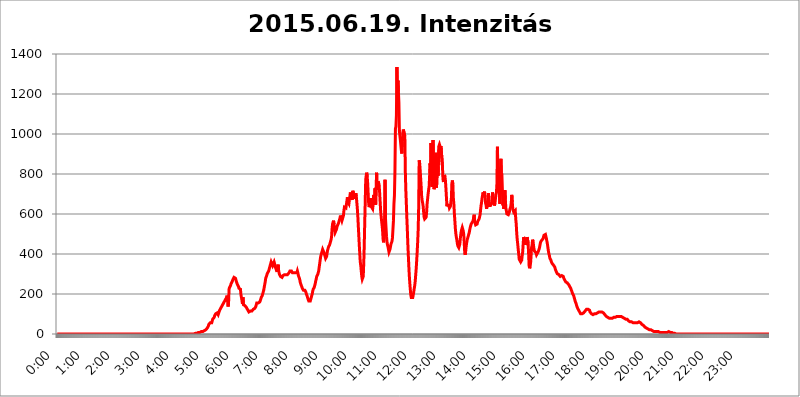
| Category | 2015.06.19. Intenzitás [W/m^2] |
|---|---|
| 0.0 | 0 |
| 0.0006944444444444445 | 0 |
| 0.001388888888888889 | 0 |
| 0.0020833333333333333 | 0 |
| 0.002777777777777778 | 0 |
| 0.003472222222222222 | 0 |
| 0.004166666666666667 | 0 |
| 0.004861111111111111 | 0 |
| 0.005555555555555556 | 0 |
| 0.0062499999999999995 | 0 |
| 0.006944444444444444 | 0 |
| 0.007638888888888889 | 0 |
| 0.008333333333333333 | 0 |
| 0.009027777777777779 | 0 |
| 0.009722222222222222 | 0 |
| 0.010416666666666666 | 0 |
| 0.011111111111111112 | 0 |
| 0.011805555555555555 | 0 |
| 0.012499999999999999 | 0 |
| 0.013194444444444444 | 0 |
| 0.013888888888888888 | 0 |
| 0.014583333333333332 | 0 |
| 0.015277777777777777 | 0 |
| 0.015972222222222224 | 0 |
| 0.016666666666666666 | 0 |
| 0.017361111111111112 | 0 |
| 0.018055555555555557 | 0 |
| 0.01875 | 0 |
| 0.019444444444444445 | 0 |
| 0.02013888888888889 | 0 |
| 0.020833333333333332 | 0 |
| 0.02152777777777778 | 0 |
| 0.022222222222222223 | 0 |
| 0.02291666666666667 | 0 |
| 0.02361111111111111 | 0 |
| 0.024305555555555556 | 0 |
| 0.024999999999999998 | 0 |
| 0.025694444444444447 | 0 |
| 0.02638888888888889 | 0 |
| 0.027083333333333334 | 0 |
| 0.027777777777777776 | 0 |
| 0.02847222222222222 | 0 |
| 0.029166666666666664 | 0 |
| 0.029861111111111113 | 0 |
| 0.030555555555555555 | 0 |
| 0.03125 | 0 |
| 0.03194444444444445 | 0 |
| 0.03263888888888889 | 0 |
| 0.03333333333333333 | 0 |
| 0.034027777777777775 | 0 |
| 0.034722222222222224 | 0 |
| 0.035416666666666666 | 0 |
| 0.036111111111111115 | 0 |
| 0.03680555555555556 | 0 |
| 0.0375 | 0 |
| 0.03819444444444444 | 0 |
| 0.03888888888888889 | 0 |
| 0.03958333333333333 | 0 |
| 0.04027777777777778 | 0 |
| 0.04097222222222222 | 0 |
| 0.041666666666666664 | 0 |
| 0.042361111111111106 | 0 |
| 0.04305555555555556 | 0 |
| 0.043750000000000004 | 0 |
| 0.044444444444444446 | 0 |
| 0.04513888888888889 | 0 |
| 0.04583333333333334 | 0 |
| 0.04652777777777778 | 0 |
| 0.04722222222222222 | 0 |
| 0.04791666666666666 | 0 |
| 0.04861111111111111 | 0 |
| 0.049305555555555554 | 0 |
| 0.049999999999999996 | 0 |
| 0.05069444444444445 | 0 |
| 0.051388888888888894 | 0 |
| 0.052083333333333336 | 0 |
| 0.05277777777777778 | 0 |
| 0.05347222222222222 | 0 |
| 0.05416666666666667 | 0 |
| 0.05486111111111111 | 0 |
| 0.05555555555555555 | 0 |
| 0.05625 | 0 |
| 0.05694444444444444 | 0 |
| 0.057638888888888885 | 0 |
| 0.05833333333333333 | 0 |
| 0.05902777777777778 | 0 |
| 0.059722222222222225 | 0 |
| 0.06041666666666667 | 0 |
| 0.061111111111111116 | 0 |
| 0.06180555555555556 | 0 |
| 0.0625 | 0 |
| 0.06319444444444444 | 0 |
| 0.06388888888888888 | 0 |
| 0.06458333333333334 | 0 |
| 0.06527777777777778 | 0 |
| 0.06597222222222222 | 0 |
| 0.06666666666666667 | 0 |
| 0.06736111111111111 | 0 |
| 0.06805555555555555 | 0 |
| 0.06874999999999999 | 0 |
| 0.06944444444444443 | 0 |
| 0.07013888888888889 | 0 |
| 0.07083333333333333 | 0 |
| 0.07152777777777779 | 0 |
| 0.07222222222222223 | 0 |
| 0.07291666666666667 | 0 |
| 0.07361111111111111 | 0 |
| 0.07430555555555556 | 0 |
| 0.075 | 0 |
| 0.07569444444444444 | 0 |
| 0.0763888888888889 | 0 |
| 0.07708333333333334 | 0 |
| 0.07777777777777778 | 0 |
| 0.07847222222222222 | 0 |
| 0.07916666666666666 | 0 |
| 0.0798611111111111 | 0 |
| 0.08055555555555556 | 0 |
| 0.08125 | 0 |
| 0.08194444444444444 | 0 |
| 0.08263888888888889 | 0 |
| 0.08333333333333333 | 0 |
| 0.08402777777777777 | 0 |
| 0.08472222222222221 | 0 |
| 0.08541666666666665 | 0 |
| 0.08611111111111112 | 0 |
| 0.08680555555555557 | 0 |
| 0.08750000000000001 | 0 |
| 0.08819444444444445 | 0 |
| 0.08888888888888889 | 0 |
| 0.08958333333333333 | 0 |
| 0.09027777777777778 | 0 |
| 0.09097222222222222 | 0 |
| 0.09166666666666667 | 0 |
| 0.09236111111111112 | 0 |
| 0.09305555555555556 | 0 |
| 0.09375 | 0 |
| 0.09444444444444444 | 0 |
| 0.09513888888888888 | 0 |
| 0.09583333333333333 | 0 |
| 0.09652777777777777 | 0 |
| 0.09722222222222222 | 0 |
| 0.09791666666666667 | 0 |
| 0.09861111111111111 | 0 |
| 0.09930555555555555 | 0 |
| 0.09999999999999999 | 0 |
| 0.10069444444444443 | 0 |
| 0.1013888888888889 | 0 |
| 0.10208333333333335 | 0 |
| 0.10277777777777779 | 0 |
| 0.10347222222222223 | 0 |
| 0.10416666666666667 | 0 |
| 0.10486111111111111 | 0 |
| 0.10555555555555556 | 0 |
| 0.10625 | 0 |
| 0.10694444444444444 | 0 |
| 0.1076388888888889 | 0 |
| 0.10833333333333334 | 0 |
| 0.10902777777777778 | 0 |
| 0.10972222222222222 | 0 |
| 0.1111111111111111 | 0 |
| 0.11180555555555556 | 0 |
| 0.11180555555555556 | 0 |
| 0.1125 | 0 |
| 0.11319444444444444 | 0 |
| 0.11388888888888889 | 0 |
| 0.11458333333333333 | 0 |
| 0.11527777777777777 | 0 |
| 0.11597222222222221 | 0 |
| 0.11666666666666665 | 0 |
| 0.1173611111111111 | 0 |
| 0.11805555555555557 | 0 |
| 0.11944444444444445 | 0 |
| 0.12013888888888889 | 0 |
| 0.12083333333333333 | 0 |
| 0.12152777777777778 | 0 |
| 0.12222222222222223 | 0 |
| 0.12291666666666667 | 0 |
| 0.12291666666666667 | 0 |
| 0.12361111111111112 | 0 |
| 0.12430555555555556 | 0 |
| 0.125 | 0 |
| 0.12569444444444444 | 0 |
| 0.12638888888888888 | 0 |
| 0.12708333333333333 | 0 |
| 0.16875 | 0 |
| 0.12847222222222224 | 0 |
| 0.12916666666666668 | 0 |
| 0.12986111111111112 | 0 |
| 0.13055555555555556 | 0 |
| 0.13125 | 0 |
| 0.13194444444444445 | 0 |
| 0.1326388888888889 | 0 |
| 0.13333333333333333 | 0 |
| 0.13402777777777777 | 0 |
| 0.13402777777777777 | 0 |
| 0.13472222222222222 | 0 |
| 0.13541666666666666 | 0 |
| 0.1361111111111111 | 0 |
| 0.13749999999999998 | 0 |
| 0.13819444444444443 | 0 |
| 0.1388888888888889 | 0 |
| 0.13958333333333334 | 0 |
| 0.14027777777777778 | 0 |
| 0.14097222222222222 | 0 |
| 0.14166666666666666 | 0 |
| 0.1423611111111111 | 0 |
| 0.14305555555555557 | 0 |
| 0.14375000000000002 | 0 |
| 0.14444444444444446 | 0 |
| 0.1451388888888889 | 0 |
| 0.1451388888888889 | 0 |
| 0.14652777777777778 | 0 |
| 0.14722222222222223 | 0 |
| 0.14791666666666667 | 0 |
| 0.1486111111111111 | 0 |
| 0.14930555555555555 | 0 |
| 0.15 | 0 |
| 0.15069444444444444 | 0 |
| 0.15138888888888888 | 0 |
| 0.15208333333333332 | 0 |
| 0.15277777777777776 | 0 |
| 0.15347222222222223 | 0 |
| 0.15416666666666667 | 0 |
| 0.15486111111111112 | 0 |
| 0.15555555555555556 | 0 |
| 0.15625 | 0 |
| 0.15694444444444444 | 0 |
| 0.15763888888888888 | 0 |
| 0.15833333333333333 | 0 |
| 0.15902777777777777 | 0 |
| 0.15972222222222224 | 0 |
| 0.16041666666666668 | 0 |
| 0.16111111111111112 | 0 |
| 0.16180555555555556 | 0 |
| 0.1625 | 0 |
| 0.16319444444444445 | 0 |
| 0.1638888888888889 | 0 |
| 0.16458333333333333 | 0 |
| 0.16527777777777777 | 0 |
| 0.16597222222222222 | 0 |
| 0.16666666666666666 | 0 |
| 0.1673611111111111 | 0 |
| 0.16805555555555554 | 0 |
| 0.16874999999999998 | 0 |
| 0.16944444444444443 | 0 |
| 0.17013888888888887 | 0 |
| 0.1708333333333333 | 0 |
| 0.17152777777777775 | 0 |
| 0.17222222222222225 | 0 |
| 0.1729166666666667 | 0 |
| 0.17361111111111113 | 0 |
| 0.17430555555555557 | 0 |
| 0.17500000000000002 | 0 |
| 0.17569444444444446 | 0 |
| 0.1763888888888889 | 0 |
| 0.17708333333333334 | 0 |
| 0.17777777777777778 | 0 |
| 0.17847222222222223 | 0 |
| 0.17916666666666667 | 0 |
| 0.1798611111111111 | 0 |
| 0.18055555555555555 | 0 |
| 0.18125 | 0 |
| 0.18194444444444444 | 0 |
| 0.1826388888888889 | 0 |
| 0.18333333333333335 | 0 |
| 0.1840277777777778 | 0 |
| 0.18472222222222223 | 0 |
| 0.18541666666666667 | 0 |
| 0.18611111111111112 | 0 |
| 0.18680555555555556 | 0 |
| 0.1875 | 0 |
| 0.18819444444444444 | 0 |
| 0.18888888888888888 | 0 |
| 0.18958333333333333 | 0 |
| 0.19027777777777777 | 0 |
| 0.1909722222222222 | 0 |
| 0.19166666666666665 | 0 |
| 0.19236111111111112 | 3.525 |
| 0.19305555555555554 | 3.525 |
| 0.19375 | 3.525 |
| 0.19444444444444445 | 3.525 |
| 0.1951388888888889 | 3.525 |
| 0.19583333333333333 | 3.525 |
| 0.19652777777777777 | 3.525 |
| 0.19722222222222222 | 3.525 |
| 0.19791666666666666 | 7.887 |
| 0.1986111111111111 | 7.887 |
| 0.19930555555555554 | 7.887 |
| 0.19999999999999998 | 7.887 |
| 0.20069444444444443 | 7.887 |
| 0.20138888888888887 | 12.257 |
| 0.2020833333333333 | 12.257 |
| 0.2027777777777778 | 12.257 |
| 0.2034722222222222 | 12.257 |
| 0.2041666666666667 | 12.257 |
| 0.20486111111111113 | 16.636 |
| 0.20555555555555557 | 16.636 |
| 0.20625000000000002 | 16.636 |
| 0.20694444444444446 | 21.024 |
| 0.2076388888888889 | 21.024 |
| 0.20833333333333334 | 21.024 |
| 0.20902777777777778 | 25.419 |
| 0.20972222222222223 | 25.419 |
| 0.21041666666666667 | 29.823 |
| 0.2111111111111111 | 34.234 |
| 0.21180555555555555 | 38.653 |
| 0.2125 | 47.511 |
| 0.21319444444444444 | 51.951 |
| 0.2138888888888889 | 51.951 |
| 0.21458333333333335 | 56.398 |
| 0.2152777777777778 | 56.398 |
| 0.21597222222222223 | 56.398 |
| 0.21666666666666667 | 56.398 |
| 0.21736111111111112 | 60.85 |
| 0.21805555555555556 | 74.246 |
| 0.21875 | 78.722 |
| 0.21944444444444444 | 78.722 |
| 0.22013888888888888 | 83.205 |
| 0.22083333333333333 | 92.184 |
| 0.22152777777777777 | 96.682 |
| 0.2222222222222222 | 101.184 |
| 0.22291666666666665 | 101.184 |
| 0.2236111111111111 | 101.184 |
| 0.22430555555555556 | 105.69 |
| 0.225 | 110.201 |
| 0.22569444444444445 | 96.682 |
| 0.2263888888888889 | 92.184 |
| 0.22708333333333333 | 101.184 |
| 0.22777777777777777 | 119.235 |
| 0.22847222222222222 | 123.758 |
| 0.22916666666666666 | 128.284 |
| 0.2298611111111111 | 132.814 |
| 0.23055555555555554 | 137.347 |
| 0.23124999999999998 | 141.884 |
| 0.23194444444444443 | 146.423 |
| 0.23263888888888887 | 146.423 |
| 0.2333333333333333 | 155.509 |
| 0.2340277777777778 | 160.056 |
| 0.2347222222222222 | 164.605 |
| 0.2354166666666667 | 169.156 |
| 0.23611111111111113 | 173.709 |
| 0.23680555555555557 | 178.264 |
| 0.23750000000000002 | 182.82 |
| 0.23819444444444446 | 191.937 |
| 0.2388888888888889 | 164.605 |
| 0.23958333333333334 | 137.347 |
| 0.24027777777777778 | 155.509 |
| 0.24097222222222223 | 223.873 |
| 0.24166666666666667 | 233 |
| 0.2423611111111111 | 237.564 |
| 0.24305555555555555 | 242.127 |
| 0.24375 | 251.251 |
| 0.24444444444444446 | 251.251 |
| 0.24513888888888888 | 260.373 |
| 0.24583333333333335 | 264.932 |
| 0.2465277777777778 | 274.047 |
| 0.24722222222222223 | 278.603 |
| 0.24791666666666667 | 283.156 |
| 0.24861111111111112 | 283.156 |
| 0.24930555555555556 | 283.156 |
| 0.25 | 278.603 |
| 0.25069444444444444 | 269.49 |
| 0.2513888888888889 | 260.373 |
| 0.2520833333333333 | 255.813 |
| 0.25277777777777777 | 246.689 |
| 0.2534722222222222 | 242.127 |
| 0.25416666666666665 | 237.564 |
| 0.2548611111111111 | 228.436 |
| 0.2555555555555556 | 228.436 |
| 0.25625000000000003 | 223.873 |
| 0.2569444444444445 | 223.873 |
| 0.2576388888888889 | 196.497 |
| 0.25833333333333336 | 196.497 |
| 0.2590277777777778 | 169.156 |
| 0.25972222222222224 | 150.964 |
| 0.2604166666666667 | 182.82 |
| 0.2611111111111111 | 146.423 |
| 0.26180555555555557 | 146.423 |
| 0.2625 | 141.884 |
| 0.26319444444444445 | 141.884 |
| 0.2638888888888889 | 137.347 |
| 0.26458333333333334 | 137.347 |
| 0.2652777777777778 | 132.814 |
| 0.2659722222222222 | 128.284 |
| 0.26666666666666666 | 128.284 |
| 0.2673611111111111 | 119.235 |
| 0.26805555555555555 | 114.716 |
| 0.26875 | 110.201 |
| 0.26944444444444443 | 110.201 |
| 0.2701388888888889 | 110.201 |
| 0.2708333333333333 | 114.716 |
| 0.27152777777777776 | 114.716 |
| 0.2722222222222222 | 114.716 |
| 0.27291666666666664 | 114.716 |
| 0.2736111111111111 | 119.235 |
| 0.2743055555555555 | 119.235 |
| 0.27499999999999997 | 123.758 |
| 0.27569444444444446 | 123.758 |
| 0.27638888888888885 | 128.284 |
| 0.27708333333333335 | 128.284 |
| 0.2777777777777778 | 132.814 |
| 0.27847222222222223 | 137.347 |
| 0.2791666666666667 | 146.423 |
| 0.2798611111111111 | 155.509 |
| 0.28055555555555556 | 160.056 |
| 0.28125 | 160.056 |
| 0.28194444444444444 | 155.509 |
| 0.2826388888888889 | 155.509 |
| 0.2833333333333333 | 155.509 |
| 0.28402777777777777 | 160.056 |
| 0.2847222222222222 | 164.605 |
| 0.28541666666666665 | 173.709 |
| 0.28611111111111115 | 182.82 |
| 0.28680555555555554 | 187.378 |
| 0.28750000000000003 | 191.937 |
| 0.2881944444444445 | 201.058 |
| 0.2888888888888889 | 210.182 |
| 0.28958333333333336 | 219.309 |
| 0.2902777777777778 | 233 |
| 0.29097222222222224 | 246.689 |
| 0.2916666666666667 | 260.373 |
| 0.2923611111111111 | 278.603 |
| 0.29305555555555557 | 283.156 |
| 0.29375 | 292.259 |
| 0.29444444444444445 | 301.354 |
| 0.2951388888888889 | 301.354 |
| 0.29583333333333334 | 305.898 |
| 0.2965277777777778 | 314.98 |
| 0.2972222222222222 | 324.052 |
| 0.29791666666666666 | 328.584 |
| 0.2986111111111111 | 342.162 |
| 0.29930555555555555 | 351.198 |
| 0.3 | 360.221 |
| 0.30069444444444443 | 364.728 |
| 0.3013888888888889 | 360.221 |
| 0.3020833333333333 | 342.162 |
| 0.30277777777777776 | 342.162 |
| 0.3034722222222222 | 342.162 |
| 0.30416666666666664 | 360.221 |
| 0.3048611111111111 | 351.198 |
| 0.3055555555555555 | 337.639 |
| 0.30624999999999997 | 333.113 |
| 0.3069444444444444 | 324.052 |
| 0.3076388888888889 | 319.517 |
| 0.30833333333333335 | 310.44 |
| 0.3090277777777778 | 314.98 |
| 0.30972222222222223 | 346.682 |
| 0.3104166666666667 | 319.517 |
| 0.3111111111111111 | 305.898 |
| 0.31180555555555556 | 296.808 |
| 0.3125 | 296.808 |
| 0.31319444444444444 | 287.709 |
| 0.3138888888888889 | 283.156 |
| 0.3145833333333333 | 283.156 |
| 0.31527777777777777 | 283.156 |
| 0.3159722222222222 | 287.709 |
| 0.31666666666666665 | 292.259 |
| 0.31736111111111115 | 296.808 |
| 0.31805555555555554 | 296.808 |
| 0.31875000000000003 | 296.808 |
| 0.3194444444444445 | 296.808 |
| 0.3201388888888889 | 296.808 |
| 0.32083333333333336 | 296.808 |
| 0.3215277777777778 | 296.808 |
| 0.32222222222222224 | 296.808 |
| 0.3229166666666667 | 296.808 |
| 0.3236111111111111 | 301.354 |
| 0.32430555555555557 | 301.354 |
| 0.325 | 305.898 |
| 0.32569444444444445 | 310.44 |
| 0.3263888888888889 | 314.98 |
| 0.32708333333333334 | 319.517 |
| 0.3277777777777778 | 319.517 |
| 0.3284722222222222 | 314.98 |
| 0.32916666666666666 | 310.44 |
| 0.3298611111111111 | 305.898 |
| 0.33055555555555555 | 305.898 |
| 0.33125 | 305.898 |
| 0.33194444444444443 | 305.898 |
| 0.3326388888888889 | 305.898 |
| 0.3333333333333333 | 310.44 |
| 0.3340277777777778 | 305.898 |
| 0.3347222222222222 | 305.898 |
| 0.3354166666666667 | 305.898 |
| 0.3361111111111111 | 305.898 |
| 0.3368055555555556 | 314.98 |
| 0.33749999999999997 | 305.898 |
| 0.33819444444444446 | 292.259 |
| 0.33888888888888885 | 287.709 |
| 0.33958333333333335 | 278.603 |
| 0.34027777777777773 | 269.49 |
| 0.34097222222222223 | 255.813 |
| 0.3416666666666666 | 251.251 |
| 0.3423611111111111 | 242.127 |
| 0.3430555555555555 | 237.564 |
| 0.34375 | 228.436 |
| 0.3444444444444445 | 228.436 |
| 0.3451388888888889 | 219.309 |
| 0.3458333333333334 | 219.309 |
| 0.34652777777777777 | 219.309 |
| 0.34722222222222227 | 219.309 |
| 0.34791666666666665 | 214.746 |
| 0.34861111111111115 | 210.182 |
| 0.34930555555555554 | 201.058 |
| 0.35000000000000003 | 196.497 |
| 0.3506944444444444 | 187.378 |
| 0.3513888888888889 | 178.264 |
| 0.3520833333333333 | 173.709 |
| 0.3527777777777778 | 164.605 |
| 0.3534722222222222 | 160.056 |
| 0.3541666666666667 | 160.056 |
| 0.3548611111111111 | 164.605 |
| 0.35555555555555557 | 173.709 |
| 0.35625 | 182.82 |
| 0.35694444444444445 | 191.937 |
| 0.3576388888888889 | 201.058 |
| 0.35833333333333334 | 214.746 |
| 0.3590277777777778 | 223.873 |
| 0.3597222222222222 | 228.436 |
| 0.36041666666666666 | 233 |
| 0.3611111111111111 | 242.127 |
| 0.36180555555555555 | 251.251 |
| 0.3625 | 264.932 |
| 0.36319444444444443 | 274.047 |
| 0.3638888888888889 | 287.709 |
| 0.3645833333333333 | 292.259 |
| 0.3652777777777778 | 296.808 |
| 0.3659722222222222 | 305.898 |
| 0.3666666666666667 | 314.98 |
| 0.3673611111111111 | 333.113 |
| 0.3680555555555556 | 351.198 |
| 0.36874999999999997 | 369.23 |
| 0.36944444444444446 | 387.202 |
| 0.37013888888888885 | 396.164 |
| 0.37083333333333335 | 405.108 |
| 0.37152777777777773 | 414.035 |
| 0.37222222222222223 | 422.943 |
| 0.3729166666666666 | 418.492 |
| 0.3736111111111111 | 418.492 |
| 0.3743055555555555 | 405.108 |
| 0.375 | 396.164 |
| 0.3756944444444445 | 387.202 |
| 0.3763888888888889 | 378.224 |
| 0.3770833333333334 | 373.729 |
| 0.37777777777777777 | 387.202 |
| 0.37847222222222227 | 405.108 |
| 0.37916666666666665 | 418.492 |
| 0.37986111111111115 | 427.39 |
| 0.38055555555555554 | 436.27 |
| 0.38125000000000003 | 440.702 |
| 0.3819444444444444 | 445.129 |
| 0.3826388888888889 | 453.968 |
| 0.3833333333333333 | 458.38 |
| 0.3840277777777778 | 471.582 |
| 0.3847222222222222 | 484.735 |
| 0.3854166666666667 | 523.88 |
| 0.3861111111111111 | 549.704 |
| 0.38680555555555557 | 558.261 |
| 0.3875 | 566.793 |
| 0.38819444444444445 | 549.704 |
| 0.3888888888888889 | 519.555 |
| 0.38958333333333334 | 506.542 |
| 0.3902777777777778 | 502.192 |
| 0.3909722222222222 | 506.542 |
| 0.39166666666666666 | 523.88 |
| 0.3923611111111111 | 536.82 |
| 0.39305555555555555 | 541.121 |
| 0.39375 | 541.121 |
| 0.39444444444444443 | 553.986 |
| 0.3951388888888889 | 562.53 |
| 0.3958333333333333 | 571.049 |
| 0.3965277777777778 | 579.542 |
| 0.3972222222222222 | 592.233 |
| 0.3979166666666667 | 588.009 |
| 0.3986111111111111 | 575.299 |
| 0.3993055555555556 | 566.793 |
| 0.39999999999999997 | 562.53 |
| 0.40069444444444446 | 571.049 |
| 0.40138888888888885 | 592.233 |
| 0.40208333333333335 | 617.436 |
| 0.40277777777777773 | 634.105 |
| 0.40347222222222223 | 634.105 |
| 0.4041666666666666 | 638.256 |
| 0.4048611111111111 | 629.948 |
| 0.4055555555555555 | 625.784 |
| 0.40625 | 634.105 |
| 0.4069444444444445 | 683.473 |
| 0.4076388888888889 | 658.909 |
| 0.4083333333333334 | 663.019 |
| 0.40902777777777777 | 650.667 |
| 0.40972222222222227 | 671.22 |
| 0.41041666666666665 | 687.544 |
| 0.41111111111111115 | 707.8 |
| 0.41180555555555554 | 691.608 |
| 0.41250000000000003 | 683.473 |
| 0.4131944444444444 | 687.544 |
| 0.4138888888888889 | 671.22 |
| 0.4145833333333333 | 715.858 |
| 0.4152777777777778 | 703.762 |
| 0.4159722222222222 | 691.608 |
| 0.4166666666666667 | 675.311 |
| 0.4173611111111111 | 687.544 |
| 0.41805555555555557 | 695.666 |
| 0.41875 | 703.762 |
| 0.41944444444444445 | 687.544 |
| 0.4201388888888889 | 658.909 |
| 0.42083333333333334 | 629.948 |
| 0.4215277777777778 | 592.233 |
| 0.4222222222222222 | 541.121 |
| 0.42291666666666666 | 493.475 |
| 0.4236111111111111 | 445.129 |
| 0.42430555555555555 | 400.638 |
| 0.425 | 360.221 |
| 0.42569444444444443 | 342.162 |
| 0.4263888888888889 | 314.98 |
| 0.4270833333333333 | 287.709 |
| 0.4277777777777778 | 274.047 |
| 0.4284722222222222 | 274.047 |
| 0.4291666666666667 | 287.709 |
| 0.4298611111111111 | 351.198 |
| 0.4305555555555556 | 440.702 |
| 0.43124999999999997 | 553.986 |
| 0.43194444444444446 | 658.909 |
| 0.43263888888888885 | 771.559 |
| 0.43333333333333335 | 791.169 |
| 0.43402777777777773 | 806.757 |
| 0.43472222222222223 | 787.258 |
| 0.4354166666666666 | 751.803 |
| 0.4361111111111111 | 699.717 |
| 0.4368055555555555 | 650.667 |
| 0.4375 | 634.105 |
| 0.4381944444444445 | 642.4 |
| 0.4388888888888889 | 663.019 |
| 0.4395833333333334 | 679.395 |
| 0.44027777777777777 | 638.256 |
| 0.44097222222222227 | 634.105 |
| 0.44166666666666665 | 642.4 |
| 0.44236111111111115 | 625.784 |
| 0.44305555555555554 | 646.537 |
| 0.44375000000000003 | 695.666 |
| 0.4444444444444444 | 691.608 |
| 0.4451388888888889 | 658.909 |
| 0.4458333333333333 | 727.896 |
| 0.4465277777777778 | 646.537 |
| 0.4472222222222222 | 731.896 |
| 0.4479166666666667 | 806.757 |
| 0.4486111111111111 | 719.877 |
| 0.44930555555555557 | 751.803 |
| 0.45 | 763.674 |
| 0.45069444444444445 | 755.766 |
| 0.4513888888888889 | 747.834 |
| 0.45208333333333334 | 711.832 |
| 0.4527777777777778 | 667.123 |
| 0.4534722222222222 | 621.613 |
| 0.45416666666666666 | 592.233 |
| 0.4548611111111111 | 566.793 |
| 0.45555555555555555 | 545.416 |
| 0.45625 | 519.555 |
| 0.45694444444444443 | 475.972 |
| 0.4576388888888889 | 458.38 |
| 0.4583333333333333 | 484.735 |
| 0.4590277777777778 | 566.793 |
| 0.4597222222222222 | 771.559 |
| 0.4604166666666667 | 575.299 |
| 0.4611111111111111 | 532.513 |
| 0.4618055555555556 | 489.108 |
| 0.46249999999999997 | 458.38 |
| 0.46319444444444446 | 445.129 |
| 0.46388888888888885 | 436.27 |
| 0.46458333333333335 | 422.943 |
| 0.46527777777777773 | 409.574 |
| 0.46597222222222223 | 405.108 |
| 0.4666666666666666 | 422.943 |
| 0.4673611111111111 | 436.27 |
| 0.4680555555555555 | 449.551 |
| 0.46875 | 449.551 |
| 0.4694444444444445 | 462.786 |
| 0.4701388888888889 | 480.356 |
| 0.4708333333333334 | 523.88 |
| 0.47152777777777777 | 566.793 |
| 0.47222222222222227 | 650.667 |
| 0.47291666666666665 | 691.608 |
| 0.47361111111111115 | 810.641 |
| 0.47430555555555554 | 1026.06 |
| 0.47500000000000003 | 1037.277 |
| 0.4756944444444444 | 1093.653 |
| 0.4763888888888889 | 1335.223 |
| 0.4770833333333333 | 1162.571 |
| 0.4777777777777778 | 1266.8 |
| 0.4784722222222222 | 1213.804 |
| 0.4791666666666667 | 1158.689 |
| 0.4798611111111111 | 1014.852 |
| 0.48055555555555557 | 1011.118 |
| 0.48125 | 970.034 |
| 0.48194444444444445 | 970.034 |
| 0.4826388888888889 | 917.534 |
| 0.48333333333333334 | 902.447 |
| 0.4840277777777778 | 962.555 |
| 0.4847222222222222 | 1007.383 |
| 0.48541666666666666 | 1022.323 |
| 0.4861111111111111 | 1018.587 |
| 0.48680555555555555 | 1018.587 |
| 0.4875 | 988.714 |
| 0.48819444444444443 | 814.519 |
| 0.4888888888888889 | 719.877 |
| 0.4895833333333333 | 654.791 |
| 0.4902777777777778 | 583.779 |
| 0.4909722222222222 | 523.88 |
| 0.4916666666666667 | 453.968 |
| 0.4923611111111111 | 396.164 |
| 0.4930555555555556 | 342.162 |
| 0.49374999999999997 | 292.259 |
| 0.49444444444444446 | 255.813 |
| 0.49513888888888885 | 223.873 |
| 0.49583333333333335 | 196.497 |
| 0.49652777777777773 | 182.82 |
| 0.49722222222222223 | 178.264 |
| 0.4979166666666666 | 178.264 |
| 0.4986111111111111 | 182.82 |
| 0.4993055555555555 | 196.497 |
| 0.5 | 210.182 |
| 0.5006944444444444 | 228.436 |
| 0.5013888888888889 | 242.127 |
| 0.5020833333333333 | 264.932 |
| 0.5027777777777778 | 296.808 |
| 0.5034722222222222 | 328.584 |
| 0.5041666666666667 | 369.23 |
| 0.5048611111111111 | 414.035 |
| 0.5055555555555555 | 462.786 |
| 0.50625 | 523.88 |
| 0.5069444444444444 | 638.256 |
| 0.5076388888888889 | 868.305 |
| 0.5083333333333333 | 853.029 |
| 0.5090277777777777 | 818.392 |
| 0.5097222222222222 | 814.519 |
| 0.5104166666666666 | 735.89 |
| 0.5111111111111112 | 687.544 |
| 0.5118055555555555 | 667.123 |
| 0.5125000000000001 | 654.791 |
| 0.5131944444444444 | 638.256 |
| 0.513888888888889 | 609.062 |
| 0.5145833333333333 | 583.779 |
| 0.5152777777777778 | 575.299 |
| 0.5159722222222222 | 575.299 |
| 0.5166666666666667 | 579.542 |
| 0.517361111111111 | 583.779 |
| 0.5180555555555556 | 609.062 |
| 0.5187499999999999 | 650.667 |
| 0.5194444444444445 | 675.311 |
| 0.5201388888888888 | 699.717 |
| 0.5208333333333334 | 719.877 |
| 0.5215277777777778 | 735.89 |
| 0.5222222222222223 | 787.258 |
| 0.5229166666666667 | 853.029 |
| 0.5236111111111111 | 771.559 |
| 0.5243055555555556 | 955.071 |
| 0.525 | 845.365 |
| 0.5256944444444445 | 735.89 |
| 0.5263888888888889 | 925.06 |
| 0.5270833333333333 | 970.034 |
| 0.5277777777777778 | 845.365 |
| 0.5284722222222222 | 723.889 |
| 0.5291666666666667 | 739.877 |
| 0.5298611111111111 | 759.723 |
| 0.5305555555555556 | 868.305 |
| 0.53125 | 906.223 |
| 0.5319444444444444 | 731.896 |
| 0.5326388888888889 | 798.974 |
| 0.5333333333333333 | 849.199 |
| 0.5340277777777778 | 791.169 |
| 0.5347222222222222 | 791.169 |
| 0.5354166666666667 | 940.082 |
| 0.5361111111111111 | 947.58 |
| 0.5368055555555555 | 943.832 |
| 0.5375 | 932.576 |
| 0.5381944444444444 | 940.082 |
| 0.5388888888888889 | 940.082 |
| 0.5395833333333333 | 943.832 |
| 0.5402777777777777 | 837.682 |
| 0.5409722222222222 | 775.492 |
| 0.5416666666666666 | 759.723 |
| 0.5423611111111112 | 783.342 |
| 0.5430555555555555 | 795.074 |
| 0.5437500000000001 | 787.258 |
| 0.5444444444444444 | 767.62 |
| 0.545138888888889 | 727.896 |
| 0.5458333333333333 | 683.473 |
| 0.5465277777777778 | 638.256 |
| 0.5472222222222222 | 646.537 |
| 0.5479166666666667 | 650.667 |
| 0.548611111111111 | 646.537 |
| 0.5493055555555556 | 642.4 |
| 0.5499999999999999 | 629.948 |
| 0.5506944444444445 | 629.948 |
| 0.5513888888888888 | 638.256 |
| 0.5520833333333334 | 638.256 |
| 0.5527777777777778 | 679.395 |
| 0.5534722222222223 | 751.803 |
| 0.5541666666666667 | 767.62 |
| 0.5548611111111111 | 747.834 |
| 0.5555555555555556 | 679.395 |
| 0.55625 | 650.667 |
| 0.5569444444444445 | 604.864 |
| 0.5576388888888889 | 566.793 |
| 0.5583333333333333 | 528.2 |
| 0.5590277777777778 | 502.192 |
| 0.5597222222222222 | 484.735 |
| 0.5604166666666667 | 471.582 |
| 0.5611111111111111 | 453.968 |
| 0.5618055555555556 | 440.702 |
| 0.5625 | 436.27 |
| 0.5631944444444444 | 431.833 |
| 0.5638888888888889 | 431.833 |
| 0.5645833333333333 | 449.551 |
| 0.5652777777777778 | 475.972 |
| 0.5659722222222222 | 497.836 |
| 0.5666666666666667 | 515.223 |
| 0.5673611111111111 | 523.88 |
| 0.5680555555555555 | 532.513 |
| 0.56875 | 532.513 |
| 0.5694444444444444 | 515.223 |
| 0.5701388888888889 | 497.836 |
| 0.5708333333333333 | 453.968 |
| 0.5715277777777777 | 405.108 |
| 0.5722222222222222 | 396.164 |
| 0.5729166666666666 | 418.492 |
| 0.5736111111111112 | 440.702 |
| 0.5743055555555555 | 458.38 |
| 0.5750000000000001 | 471.582 |
| 0.5756944444444444 | 480.356 |
| 0.576388888888889 | 489.108 |
| 0.5770833333333333 | 497.836 |
| 0.5777777777777778 | 506.542 |
| 0.5784722222222222 | 519.555 |
| 0.5791666666666667 | 532.513 |
| 0.579861111111111 | 541.121 |
| 0.5805555555555556 | 549.704 |
| 0.5812499999999999 | 553.986 |
| 0.5819444444444445 | 558.261 |
| 0.5826388888888888 | 562.53 |
| 0.5833333333333334 | 566.793 |
| 0.5840277777777778 | 583.779 |
| 0.5847222222222223 | 596.45 |
| 0.5854166666666667 | 562.53 |
| 0.5861111111111111 | 553.986 |
| 0.5868055555555556 | 545.416 |
| 0.5875 | 541.121 |
| 0.5881944444444445 | 545.416 |
| 0.5888888888888889 | 549.704 |
| 0.5895833333333333 | 562.53 |
| 0.5902777777777778 | 566.793 |
| 0.5909722222222222 | 566.793 |
| 0.5916666666666667 | 575.299 |
| 0.5923611111111111 | 575.299 |
| 0.5930555555555556 | 596.45 |
| 0.59375 | 621.613 |
| 0.5944444444444444 | 642.4 |
| 0.5951388888888889 | 658.909 |
| 0.5958333333333333 | 679.395 |
| 0.5965277777777778 | 683.473 |
| 0.5972222222222222 | 707.8 |
| 0.5979166666666667 | 695.666 |
| 0.5986111111111111 | 699.717 |
| 0.5993055555555555 | 711.832 |
| 0.6 | 683.473 |
| 0.6006944444444444 | 654.791 |
| 0.6013888888888889 | 646.537 |
| 0.6020833333333333 | 625.784 |
| 0.6027777777777777 | 638.256 |
| 0.6034722222222222 | 642.4 |
| 0.6041666666666666 | 675.311 |
| 0.6048611111111112 | 703.762 |
| 0.6055555555555555 | 642.4 |
| 0.6062500000000001 | 638.256 |
| 0.6069444444444444 | 642.4 |
| 0.607638888888889 | 642.4 |
| 0.6083333333333333 | 642.4 |
| 0.6090277777777778 | 642.4 |
| 0.6097222222222222 | 654.791 |
| 0.6104166666666667 | 707.8 |
| 0.611111111111111 | 683.473 |
| 0.6118055555555556 | 667.123 |
| 0.6124999999999999 | 683.473 |
| 0.6131944444444445 | 642.4 |
| 0.6138888888888888 | 654.791 |
| 0.6145833333333334 | 675.311 |
| 0.6152777777777778 | 699.717 |
| 0.6159722222222223 | 707.8 |
| 0.6166666666666667 | 751.803 |
| 0.6173611111111111 | 936.33 |
| 0.6180555555555556 | 763.674 |
| 0.61875 | 751.803 |
| 0.6194444444444445 | 723.889 |
| 0.6201388888888889 | 691.608 |
| 0.6208333333333333 | 650.667 |
| 0.6215277777777778 | 814.519 |
| 0.6222222222222222 | 875.918 |
| 0.6229166666666667 | 806.757 |
| 0.6236111111111111 | 798.974 |
| 0.6243055555555556 | 798.974 |
| 0.625 | 642.4 |
| 0.6256944444444444 | 658.909 |
| 0.6263888888888889 | 625.784 |
| 0.6270833333333333 | 634.105 |
| 0.6277777777777778 | 719.877 |
| 0.6284722222222222 | 671.22 |
| 0.6291666666666667 | 629.948 |
| 0.6298611111111111 | 617.436 |
| 0.6305555555555555 | 600.661 |
| 0.63125 | 596.45 |
| 0.6319444444444444 | 596.45 |
| 0.6326388888888889 | 596.45 |
| 0.6333333333333333 | 600.661 |
| 0.6340277777777777 | 609.062 |
| 0.6347222222222222 | 621.613 |
| 0.6354166666666666 | 629.948 |
| 0.6361111111111112 | 638.256 |
| 0.6368055555555555 | 658.909 |
| 0.6375000000000001 | 695.666 |
| 0.6381944444444444 | 658.909 |
| 0.638888888888889 | 625.784 |
| 0.6395833333333333 | 617.436 |
| 0.6402777777777778 | 609.062 |
| 0.6409722222222222 | 604.864 |
| 0.6416666666666667 | 613.252 |
| 0.642361111111111 | 617.436 |
| 0.6430555555555556 | 575.299 |
| 0.6437499999999999 | 549.704 |
| 0.6444444444444445 | 502.192 |
| 0.6451388888888888 | 471.582 |
| 0.6458333333333334 | 449.551 |
| 0.6465277777777778 | 422.943 |
| 0.6472222222222223 | 400.638 |
| 0.6479166666666667 | 373.729 |
| 0.6486111111111111 | 369.23 |
| 0.6493055555555556 | 369.23 |
| 0.65 | 360.221 |
| 0.6506944444444445 | 355.712 |
| 0.6513888888888889 | 369.23 |
| 0.6520833333333333 | 391.685 |
| 0.6527777777777778 | 409.574 |
| 0.6534722222222222 | 449.551 |
| 0.6541666666666667 | 484.735 |
| 0.6548611111111111 | 489.108 |
| 0.6555555555555556 | 484.735 |
| 0.65625 | 467.187 |
| 0.6569444444444444 | 445.129 |
| 0.6576388888888889 | 445.129 |
| 0.6583333333333333 | 462.786 |
| 0.6590277777777778 | 484.735 |
| 0.6597222222222222 | 484.735 |
| 0.6604166666666667 | 453.968 |
| 0.6611111111111111 | 400.638 |
| 0.6618055555555555 | 342.162 |
| 0.6625 | 328.584 |
| 0.6631944444444444 | 337.639 |
| 0.6638888888888889 | 355.712 |
| 0.6645833333333333 | 391.685 |
| 0.6652777777777777 | 431.833 |
| 0.6659722222222222 | 445.129 |
| 0.6666666666666666 | 471.582 |
| 0.6673611111111111 | 462.786 |
| 0.6680555555555556 | 440.702 |
| 0.6687500000000001 | 422.943 |
| 0.6694444444444444 | 414.035 |
| 0.6701388888888888 | 414.035 |
| 0.6708333333333334 | 409.574 |
| 0.6715277777777778 | 405.108 |
| 0.6722222222222222 | 396.164 |
| 0.6729166666666666 | 391.685 |
| 0.6736111111111112 | 400.638 |
| 0.6743055555555556 | 409.574 |
| 0.6749999999999999 | 409.574 |
| 0.6756944444444444 | 422.943 |
| 0.6763888888888889 | 431.833 |
| 0.6770833333333334 | 445.129 |
| 0.6777777777777777 | 458.38 |
| 0.6784722222222223 | 462.786 |
| 0.6791666666666667 | 467.187 |
| 0.6798611111111111 | 467.187 |
| 0.6805555555555555 | 467.187 |
| 0.68125 | 475.972 |
| 0.6819444444444445 | 484.735 |
| 0.6826388888888889 | 493.475 |
| 0.6833333333333332 | 497.836 |
| 0.6840277777777778 | 493.475 |
| 0.6847222222222222 | 497.836 |
| 0.6854166666666667 | 497.836 |
| 0.686111111111111 | 475.972 |
| 0.6868055555555556 | 462.786 |
| 0.6875 | 449.551 |
| 0.6881944444444444 | 431.833 |
| 0.688888888888889 | 414.035 |
| 0.6895833333333333 | 400.638 |
| 0.6902777777777778 | 391.685 |
| 0.6909722222222222 | 378.224 |
| 0.6916666666666668 | 373.729 |
| 0.6923611111111111 | 369.23 |
| 0.6930555555555555 | 360.221 |
| 0.69375 | 355.712 |
| 0.6944444444444445 | 351.198 |
| 0.6951388888888889 | 351.198 |
| 0.6958333333333333 | 346.682 |
| 0.6965277777777777 | 342.162 |
| 0.6972222222222223 | 337.639 |
| 0.6979166666666666 | 333.113 |
| 0.6986111111111111 | 324.052 |
| 0.6993055555555556 | 319.517 |
| 0.7000000000000001 | 310.44 |
| 0.7006944444444444 | 305.898 |
| 0.7013888888888888 | 301.354 |
| 0.7020833333333334 | 301.354 |
| 0.7027777777777778 | 296.808 |
| 0.7034722222222222 | 296.808 |
| 0.7041666666666666 | 292.259 |
| 0.7048611111111112 | 292.259 |
| 0.7055555555555556 | 287.709 |
| 0.7062499999999999 | 287.709 |
| 0.7069444444444444 | 287.709 |
| 0.7076388888888889 | 292.259 |
| 0.7083333333333334 | 292.259 |
| 0.7090277777777777 | 287.709 |
| 0.7097222222222223 | 287.709 |
| 0.7104166666666667 | 278.603 |
| 0.7111111111111111 | 274.047 |
| 0.7118055555555555 | 269.49 |
| 0.7125 | 269.49 |
| 0.7131944444444445 | 260.373 |
| 0.7138888888888889 | 260.373 |
| 0.7145833333333332 | 255.813 |
| 0.7152777777777778 | 255.813 |
| 0.7159722222222222 | 251.251 |
| 0.7166666666666667 | 251.251 |
| 0.717361111111111 | 246.689 |
| 0.7180555555555556 | 242.127 |
| 0.71875 | 237.564 |
| 0.7194444444444444 | 233 |
| 0.720138888888889 | 228.436 |
| 0.7208333333333333 | 223.873 |
| 0.7215277777777778 | 214.746 |
| 0.7222222222222222 | 210.182 |
| 0.7229166666666668 | 201.058 |
| 0.7236111111111111 | 196.497 |
| 0.7243055555555555 | 191.937 |
| 0.725 | 182.82 |
| 0.7256944444444445 | 173.709 |
| 0.7263888888888889 | 164.605 |
| 0.7270833333333333 | 160.056 |
| 0.7277777777777777 | 150.964 |
| 0.7284722222222223 | 141.884 |
| 0.7291666666666666 | 137.347 |
| 0.7298611111111111 | 128.284 |
| 0.7305555555555556 | 123.758 |
| 0.7312500000000001 | 119.235 |
| 0.7319444444444444 | 114.716 |
| 0.7326388888888888 | 110.201 |
| 0.7333333333333334 | 105.69 |
| 0.7340277777777778 | 101.184 |
| 0.7347222222222222 | 101.184 |
| 0.7354166666666666 | 101.184 |
| 0.7361111111111112 | 101.184 |
| 0.7368055555555556 | 101.184 |
| 0.7374999999999999 | 105.69 |
| 0.7381944444444444 | 105.69 |
| 0.7388888888888889 | 110.201 |
| 0.7395833333333334 | 110.201 |
| 0.7402777777777777 | 114.716 |
| 0.7409722222222223 | 119.235 |
| 0.7416666666666667 | 119.235 |
| 0.7423611111111111 | 123.758 |
| 0.7430555555555555 | 123.758 |
| 0.74375 | 123.758 |
| 0.7444444444444445 | 123.758 |
| 0.7451388888888889 | 123.758 |
| 0.7458333333333332 | 119.235 |
| 0.7465277777777778 | 119.235 |
| 0.7472222222222222 | 110.201 |
| 0.7479166666666667 | 110.201 |
| 0.748611111111111 | 105.69 |
| 0.7493055555555556 | 101.184 |
| 0.75 | 101.184 |
| 0.7506944444444444 | 96.682 |
| 0.751388888888889 | 96.682 |
| 0.7520833333333333 | 96.682 |
| 0.7527777777777778 | 96.682 |
| 0.7534722222222222 | 101.184 |
| 0.7541666666666668 | 101.184 |
| 0.7548611111111111 | 101.184 |
| 0.7555555555555555 | 101.184 |
| 0.75625 | 101.184 |
| 0.7569444444444445 | 105.69 |
| 0.7576388888888889 | 105.69 |
| 0.7583333333333333 | 105.69 |
| 0.7590277777777777 | 105.69 |
| 0.7597222222222223 | 110.201 |
| 0.7604166666666666 | 110.201 |
| 0.7611111111111111 | 110.201 |
| 0.7618055555555556 | 110.201 |
| 0.7625000000000001 | 110.201 |
| 0.7631944444444444 | 110.201 |
| 0.7638888888888888 | 110.201 |
| 0.7645833333333334 | 110.201 |
| 0.7652777777777778 | 105.69 |
| 0.7659722222222222 | 105.69 |
| 0.7666666666666666 | 101.184 |
| 0.7673611111111112 | 101.184 |
| 0.7680555555555556 | 96.682 |
| 0.7687499999999999 | 92.184 |
| 0.7694444444444444 | 92.184 |
| 0.7701388888888889 | 87.692 |
| 0.7708333333333334 | 83.205 |
| 0.7715277777777777 | 83.205 |
| 0.7722222222222223 | 83.205 |
| 0.7729166666666667 | 78.722 |
| 0.7736111111111111 | 78.722 |
| 0.7743055555555555 | 78.722 |
| 0.775 | 78.722 |
| 0.7756944444444445 | 78.722 |
| 0.7763888888888889 | 78.722 |
| 0.7770833333333332 | 78.722 |
| 0.7777777777777778 | 78.722 |
| 0.7784722222222222 | 78.722 |
| 0.7791666666666667 | 78.722 |
| 0.779861111111111 | 78.722 |
| 0.7805555555555556 | 83.205 |
| 0.78125 | 83.205 |
| 0.7819444444444444 | 83.205 |
| 0.782638888888889 | 83.205 |
| 0.7833333333333333 | 83.205 |
| 0.7840277777777778 | 87.692 |
| 0.7847222222222222 | 87.692 |
| 0.7854166666666668 | 87.692 |
| 0.7861111111111111 | 87.692 |
| 0.7868055555555555 | 87.692 |
| 0.7875 | 92.184 |
| 0.7881944444444445 | 87.692 |
| 0.7888888888888889 | 87.692 |
| 0.7895833333333333 | 87.692 |
| 0.7902777777777777 | 87.692 |
| 0.7909722222222223 | 87.692 |
| 0.7916666666666666 | 83.205 |
| 0.7923611111111111 | 83.205 |
| 0.7930555555555556 | 83.205 |
| 0.7937500000000001 | 83.205 |
| 0.7944444444444444 | 78.722 |
| 0.7951388888888888 | 78.722 |
| 0.7958333333333334 | 78.722 |
| 0.7965277777777778 | 78.722 |
| 0.7972222222222222 | 74.246 |
| 0.7979166666666666 | 74.246 |
| 0.7986111111111112 | 74.246 |
| 0.7993055555555556 | 74.246 |
| 0.7999999999999999 | 69.775 |
| 0.8006944444444444 | 69.775 |
| 0.8013888888888889 | 65.31 |
| 0.8020833333333334 | 65.31 |
| 0.8027777777777777 | 65.31 |
| 0.8034722222222223 | 60.85 |
| 0.8041666666666667 | 60.85 |
| 0.8048611111111111 | 60.85 |
| 0.8055555555555555 | 60.85 |
| 0.80625 | 60.85 |
| 0.8069444444444445 | 60.85 |
| 0.8076388888888889 | 56.398 |
| 0.8083333333333332 | 56.398 |
| 0.8090277777777778 | 56.398 |
| 0.8097222222222222 | 56.398 |
| 0.8104166666666667 | 56.398 |
| 0.811111111111111 | 56.398 |
| 0.8118055555555556 | 56.398 |
| 0.8125 | 56.398 |
| 0.8131944444444444 | 56.398 |
| 0.813888888888889 | 56.398 |
| 0.8145833333333333 | 56.398 |
| 0.8152777777777778 | 60.85 |
| 0.8159722222222222 | 60.85 |
| 0.8166666666666668 | 60.85 |
| 0.8173611111111111 | 56.398 |
| 0.8180555555555555 | 56.398 |
| 0.81875 | 56.398 |
| 0.8194444444444445 | 51.951 |
| 0.8201388888888889 | 47.511 |
| 0.8208333333333333 | 47.511 |
| 0.8215277777777777 | 43.079 |
| 0.8222222222222223 | 43.079 |
| 0.8229166666666666 | 38.653 |
| 0.8236111111111111 | 38.653 |
| 0.8243055555555556 | 34.234 |
| 0.8250000000000001 | 34.234 |
| 0.8256944444444444 | 29.823 |
| 0.8263888888888888 | 29.823 |
| 0.8270833333333334 | 29.823 |
| 0.8277777777777778 | 25.419 |
| 0.8284722222222222 | 25.419 |
| 0.8291666666666666 | 25.419 |
| 0.8298611111111112 | 25.419 |
| 0.8305555555555556 | 21.024 |
| 0.8312499999999999 | 21.024 |
| 0.8319444444444444 | 21.024 |
| 0.8326388888888889 | 21.024 |
| 0.8333333333333334 | 16.636 |
| 0.8340277777777777 | 16.636 |
| 0.8347222222222223 | 16.636 |
| 0.8354166666666667 | 16.636 |
| 0.8361111111111111 | 16.636 |
| 0.8368055555555555 | 12.257 |
| 0.8375 | 16.636 |
| 0.8381944444444445 | 12.257 |
| 0.8388888888888889 | 12.257 |
| 0.8395833333333332 | 12.257 |
| 0.8402777777777778 | 12.257 |
| 0.8409722222222222 | 12.257 |
| 0.8416666666666667 | 12.257 |
| 0.842361111111111 | 12.257 |
| 0.8430555555555556 | 12.257 |
| 0.84375 | 12.257 |
| 0.8444444444444444 | 7.887 |
| 0.845138888888889 | 7.887 |
| 0.8458333333333333 | 7.887 |
| 0.8465277777777778 | 7.887 |
| 0.8472222222222222 | 7.887 |
| 0.8479166666666668 | 7.887 |
| 0.8486111111111111 | 7.887 |
| 0.8493055555555555 | 7.887 |
| 0.85 | 7.887 |
| 0.8506944444444445 | 7.887 |
| 0.8513888888888889 | 7.887 |
| 0.8520833333333333 | 7.887 |
| 0.8527777777777777 | 7.887 |
| 0.8534722222222223 | 7.887 |
| 0.8541666666666666 | 7.887 |
| 0.8548611111111111 | 7.887 |
| 0.8555555555555556 | 7.887 |
| 0.8562500000000001 | 12.257 |
| 0.8569444444444444 | 12.257 |
| 0.8576388888888888 | 12.257 |
| 0.8583333333333334 | 12.257 |
| 0.8590277777777778 | 12.257 |
| 0.8597222222222222 | 7.887 |
| 0.8604166666666666 | 7.887 |
| 0.8611111111111112 | 7.887 |
| 0.8618055555555556 | 7.887 |
| 0.8624999999999999 | 3.525 |
| 0.8631944444444444 | 3.525 |
| 0.8638888888888889 | 3.525 |
| 0.8645833333333334 | 3.525 |
| 0.8652777777777777 | 3.525 |
| 0.8659722222222223 | 3.525 |
| 0.8666666666666667 | 0 |
| 0.8673611111111111 | 0 |
| 0.8680555555555555 | 0 |
| 0.86875 | 0 |
| 0.8694444444444445 | 0 |
| 0.8701388888888889 | 0 |
| 0.8708333333333332 | 0 |
| 0.8715277777777778 | 0 |
| 0.8722222222222222 | 0 |
| 0.8729166666666667 | 0 |
| 0.873611111111111 | 0 |
| 0.8743055555555556 | 0 |
| 0.875 | 0 |
| 0.8756944444444444 | 0 |
| 0.876388888888889 | 0 |
| 0.8770833333333333 | 0 |
| 0.8777777777777778 | 0 |
| 0.8784722222222222 | 0 |
| 0.8791666666666668 | 0 |
| 0.8798611111111111 | 0 |
| 0.8805555555555555 | 0 |
| 0.88125 | 0 |
| 0.8819444444444445 | 0 |
| 0.8826388888888889 | 0 |
| 0.8833333333333333 | 0 |
| 0.8840277777777777 | 0 |
| 0.8847222222222223 | 0 |
| 0.8854166666666666 | 0 |
| 0.8861111111111111 | 0 |
| 0.8868055555555556 | 0 |
| 0.8875000000000001 | 0 |
| 0.8881944444444444 | 0 |
| 0.8888888888888888 | 0 |
| 0.8895833333333334 | 0 |
| 0.8902777777777778 | 0 |
| 0.8909722222222222 | 0 |
| 0.8916666666666666 | 0 |
| 0.8923611111111112 | 0 |
| 0.8930555555555556 | 0 |
| 0.8937499999999999 | 0 |
| 0.8944444444444444 | 0 |
| 0.8951388888888889 | 0 |
| 0.8958333333333334 | 0 |
| 0.8965277777777777 | 0 |
| 0.8972222222222223 | 0 |
| 0.8979166666666667 | 0 |
| 0.8986111111111111 | 0 |
| 0.8993055555555555 | 0 |
| 0.9 | 0 |
| 0.9006944444444445 | 0 |
| 0.9013888888888889 | 0 |
| 0.9020833333333332 | 0 |
| 0.9027777777777778 | 0 |
| 0.9034722222222222 | 0 |
| 0.9041666666666667 | 0 |
| 0.904861111111111 | 0 |
| 0.9055555555555556 | 0 |
| 0.90625 | 0 |
| 0.9069444444444444 | 0 |
| 0.907638888888889 | 0 |
| 0.9083333333333333 | 0 |
| 0.9090277777777778 | 0 |
| 0.9097222222222222 | 0 |
| 0.9104166666666668 | 0 |
| 0.9111111111111111 | 0 |
| 0.9118055555555555 | 0 |
| 0.9125 | 0 |
| 0.9131944444444445 | 0 |
| 0.9138888888888889 | 0 |
| 0.9145833333333333 | 0 |
| 0.9152777777777777 | 0 |
| 0.9159722222222223 | 0 |
| 0.9166666666666666 | 0 |
| 0.9173611111111111 | 0 |
| 0.9180555555555556 | 0 |
| 0.9187500000000001 | 0 |
| 0.9194444444444444 | 0 |
| 0.9201388888888888 | 0 |
| 0.9208333333333334 | 0 |
| 0.9215277777777778 | 0 |
| 0.9222222222222222 | 0 |
| 0.9229166666666666 | 0 |
| 0.9236111111111112 | 0 |
| 0.9243055555555556 | 0 |
| 0.9249999999999999 | 0 |
| 0.9256944444444444 | 0 |
| 0.9263888888888889 | 0 |
| 0.9270833333333334 | 0 |
| 0.9277777777777777 | 0 |
| 0.9284722222222223 | 0 |
| 0.9291666666666667 | 0 |
| 0.9298611111111111 | 0 |
| 0.9305555555555555 | 0 |
| 0.93125 | 0 |
| 0.9319444444444445 | 0 |
| 0.9326388888888889 | 0 |
| 0.9333333333333332 | 0 |
| 0.9340277777777778 | 0 |
| 0.9347222222222222 | 0 |
| 0.9354166666666667 | 0 |
| 0.936111111111111 | 0 |
| 0.9368055555555556 | 0 |
| 0.9375 | 0 |
| 0.9381944444444444 | 0 |
| 0.938888888888889 | 0 |
| 0.9395833333333333 | 0 |
| 0.9402777777777778 | 0 |
| 0.9409722222222222 | 0 |
| 0.9416666666666668 | 0 |
| 0.9423611111111111 | 0 |
| 0.9430555555555555 | 0 |
| 0.94375 | 0 |
| 0.9444444444444445 | 0 |
| 0.9451388888888889 | 0 |
| 0.9458333333333333 | 0 |
| 0.9465277777777777 | 0 |
| 0.9472222222222223 | 0 |
| 0.9479166666666666 | 0 |
| 0.9486111111111111 | 0 |
| 0.9493055555555556 | 0 |
| 0.9500000000000001 | 0 |
| 0.9506944444444444 | 0 |
| 0.9513888888888888 | 0 |
| 0.9520833333333334 | 0 |
| 0.9527777777777778 | 0 |
| 0.9534722222222222 | 0 |
| 0.9541666666666666 | 0 |
| 0.9548611111111112 | 0 |
| 0.9555555555555556 | 0 |
| 0.9562499999999999 | 0 |
| 0.9569444444444444 | 0 |
| 0.9576388888888889 | 0 |
| 0.9583333333333334 | 0 |
| 0.9590277777777777 | 0 |
| 0.9597222222222223 | 0 |
| 0.9604166666666667 | 0 |
| 0.9611111111111111 | 0 |
| 0.9618055555555555 | 0 |
| 0.9625 | 0 |
| 0.9631944444444445 | 0 |
| 0.9638888888888889 | 0 |
| 0.9645833333333332 | 0 |
| 0.9652777777777778 | 0 |
| 0.9659722222222222 | 0 |
| 0.9666666666666667 | 0 |
| 0.967361111111111 | 0 |
| 0.9680555555555556 | 0 |
| 0.96875 | 0 |
| 0.9694444444444444 | 0 |
| 0.970138888888889 | 0 |
| 0.9708333333333333 | 0 |
| 0.9715277777777778 | 0 |
| 0.9722222222222222 | 0 |
| 0.9729166666666668 | 0 |
| 0.9736111111111111 | 0 |
| 0.9743055555555555 | 0 |
| 0.975 | 0 |
| 0.9756944444444445 | 0 |
| 0.9763888888888889 | 0 |
| 0.9770833333333333 | 0 |
| 0.9777777777777777 | 0 |
| 0.9784722222222223 | 0 |
| 0.9791666666666666 | 0 |
| 0.9798611111111111 | 0 |
| 0.9805555555555556 | 0 |
| 0.9812500000000001 | 0 |
| 0.9819444444444444 | 0 |
| 0.9826388888888888 | 0 |
| 0.9833333333333334 | 0 |
| 0.9840277777777778 | 0 |
| 0.9847222222222222 | 0 |
| 0.9854166666666666 | 0 |
| 0.9861111111111112 | 0 |
| 0.9868055555555556 | 0 |
| 0.9874999999999999 | 0 |
| 0.9881944444444444 | 0 |
| 0.9888888888888889 | 0 |
| 0.9895833333333334 | 0 |
| 0.9902777777777777 | 0 |
| 0.9909722222222223 | 0 |
| 0.9916666666666667 | 0 |
| 0.9923611111111111 | 0 |
| 0.9930555555555555 | 0 |
| 0.99375 | 0 |
| 0.9944444444444445 | 0 |
| 0.9951388888888889 | 0 |
| 0.9958333333333332 | 0 |
| 0.9965277777777778 | 0 |
| 0.9972222222222222 | 0 |
| 0.9979166666666667 | 0 |
| 0.998611111111111 | 0 |
| 0.9993055555555556 | 0 |